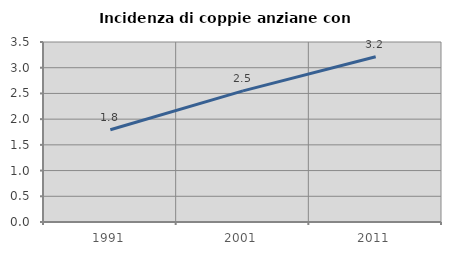
| Category | Incidenza di coppie anziane con figli |
|---|---|
| 1991.0 | 1.793 |
| 2001.0 | 2.549 |
| 2011.0 | 3.214 |